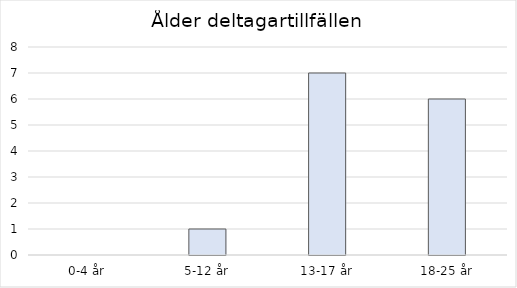
| Category | Series 0 |
|---|---|
| 0-4 år | 0 |
| 5-12 år | 1 |
| 13-17 år | 7 |
| 18-25 år | 6 |